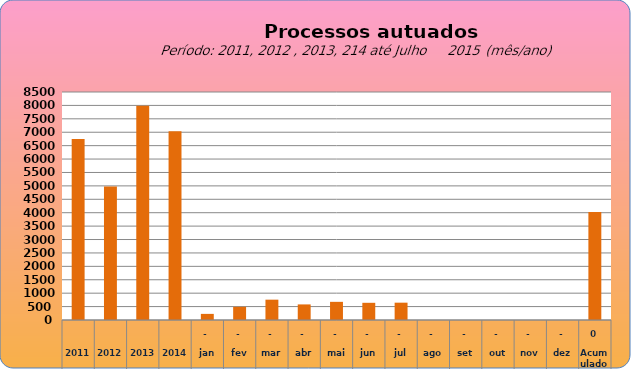
| Category | 6749 4978 7990 7034  228   486   758   581   676   641   646   -     -     -     -     -     4.016  |
|---|---|
| 2011 | 6749 |
| 2012 | 4978 |
| 2013 | 7990 |
| 2014 | 7034 |
| jan | 228 |
| fev | 492 |
| mar | 758 |
| abr | 581 |
| mai | 677 |
| jun | 641 |
| jul | 646 |
| ago | 0 |
| set | 0 |
| out | 0 |
| nov | 0 |
| dez | 0 |
| Acumulado
 | 4023 |